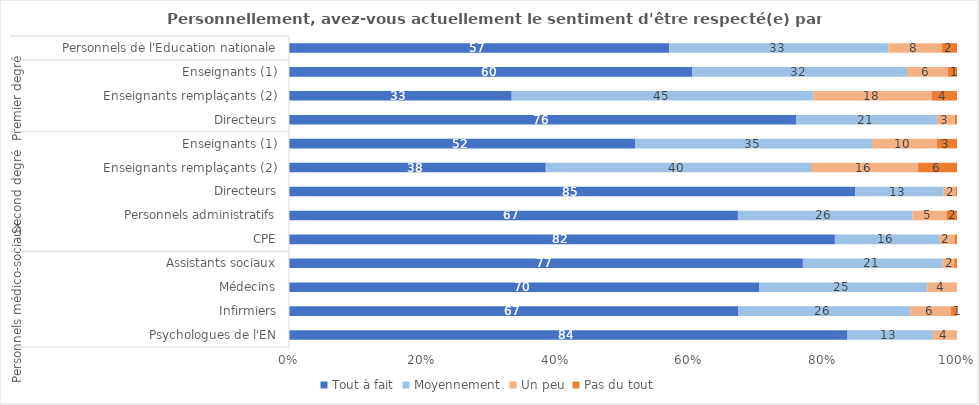
| Category | Tout à fait | Moyennement | Un peu | Pas du tout |
|---|---|---|---|---|
| 0 | 83.61 | 12.79 | 3.6 | 0 |
| 1 | 67.24 | 25.76 | 6.12 | 0.89 |
| 2 | 70.43 | 25.11 | 4.46 | 0 |
| 3 | 76.92 | 20.93 | 1.72 | 0.42 |
| 4 | 81.72 | 15.65 | 2.24 | 0.39 |
| 5 | 67.2 | 26.12 | 5.08 | 1.59 |
| 6 | 84.74 | 13.25 | 1.78 | 0.23 |
| 7 | 38.44 | 39.7 | 16.05 | 5.81 |
| 8 | 51.81 | 35.47 | 9.71 | 3.01 |
| 9 | 75.96 | 21.06 | 2.68 | 0.3 |
| 10 | 33.34 | 45.22 | 17.62 | 3.82 |
| 11 | 60.38 | 32.14 | 6.08 | 1.4 |
| 12 | 56.91 | 32.8 | 8.04 | 2.25 |